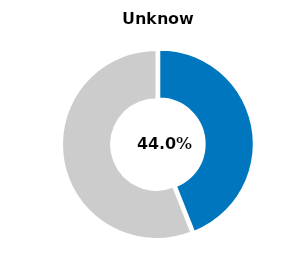
| Category | Series 0 |
|---|---|
| Unknown | 0.44 |
| Other | 0.56 |